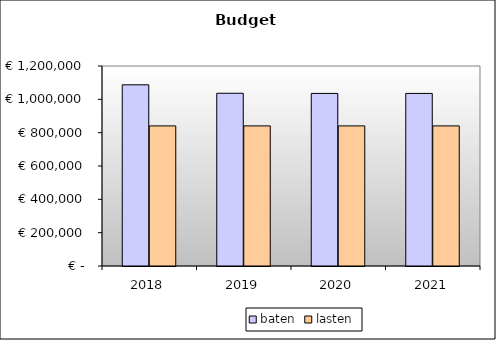
| Category | baten | lasten |
|---|---|---|
| 2018.0 | 1087123.457 | 840632.2 |
| 2019.0 | 1036479.404 | 840632.2 |
| 2020.0 | 1035437.301 | 840632.2 |
| 2021.0 | 1035437.301 | 840632.2 |